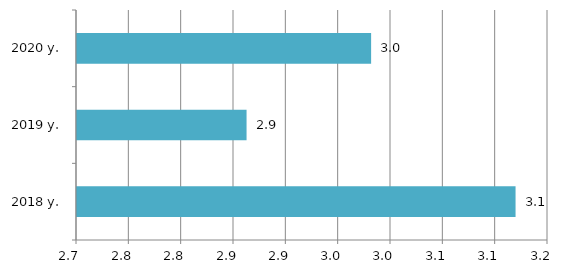
| Category | Series 0 |
|---|---|
| 2018 y. | 3.119 |
| 2019 y. | 2.862 |
| 2020 y. | 2.981 |